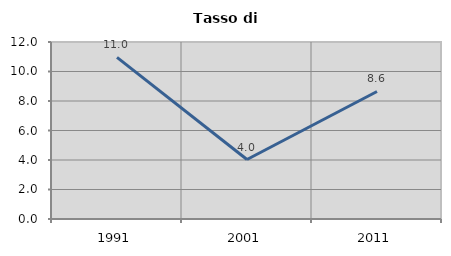
| Category | Tasso di disoccupazione   |
|---|---|
| 1991.0 | 10.959 |
| 2001.0 | 4.032 |
| 2011.0 | 8.647 |